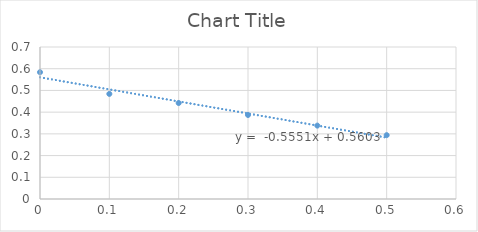
| Category | Series 0 |
|---|---|
| 0.5 | 0.294 |
| 0.4 | 0.338 |
| 0.3 | 0.387 |
| 0.2 | 0.442 |
| 0.1 | 0.484 |
| 0.0 | 0.584 |